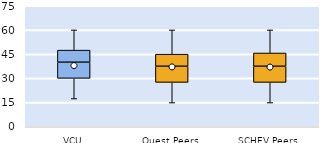
| Category | 25th | 50th | 75th |
|---|---|---|---|
| VCU | 30 | 10 | 7.5 |
| Quest Peers | 27.5 | 10 | 7.5 |
| SCHEV Peers | 27.5 | 10 | 8.214 |